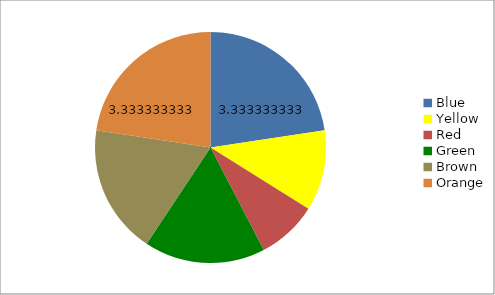
| Category | Series 0 |
|---|---|
| Blue | 3.333 |
| Yellow | 1.667 |
| Red | 1.25 |
| Green | 2.5 |
| Brown | 2.667 |
| Orange | 3.333 |